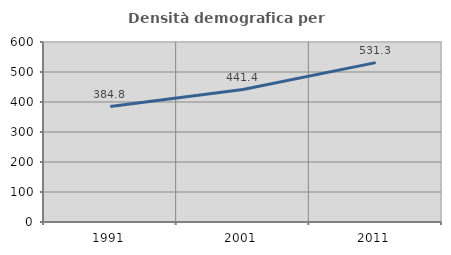
| Category | Densità demografica |
|---|---|
| 1991.0 | 384.814 |
| 2001.0 | 441.419 |
| 2011.0 | 531.256 |